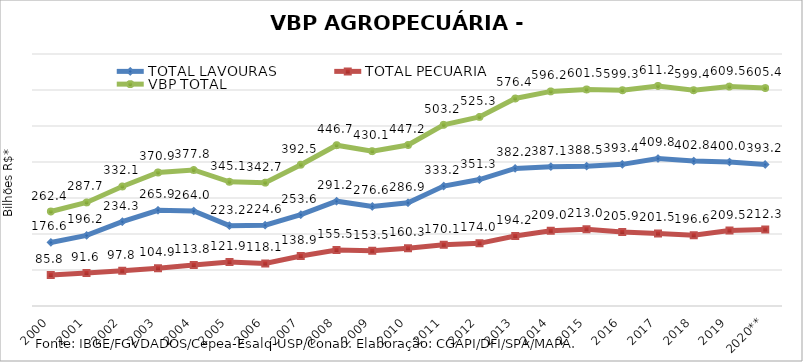
| Category | TOTAL LAVOURAS | TOTAL PECUÁRIA | VBP TOTAL |
|---|---|---|---|
| 2000 | 176.589 | 85.838 | 262.427 |
| 2001 | 196.158 | 91.578 | 287.736 |
| 2002 | 234.317 | 97.76 | 332.077 |
| 2003 | 265.948 | 104.929 | 370.877 |
| 2004 | 264.001 | 113.818 | 377.818 |
| 2005 | 223.201 | 121.927 | 345.127 |
| 2006 | 224.564 | 118.087 | 342.651 |
| 2007 | 253.604 | 138.923 | 392.527 |
| 2008 | 291.201 | 155.488 | 446.689 |
| 2009 | 276.602 | 153.466 | 430.068 |
| 2010 | 286.867 | 160.342 | 447.209 |
| 2011 | 333.16 | 170.082 | 503.242 |
| 2012 | 351.277 | 173.983 | 525.261 |
| 2013 | 382.192 | 194.231 | 576.423 |
| 2014 | 387.109 | 209.048 | 596.157 |
| 2015 | 388.514 | 212.963 | 601.477 |
| 2016 | 393.426 | 205.882 | 599.309 |
| 2017 | 409.773 | 201.458 | 611.231 |
| 2018 | 402.767 | 196.586 | 599.353 |
| 2019 | 399.97 | 209.545 | 609.515 |
| 2020** | 393.18 | 212.253 | 605.433 |